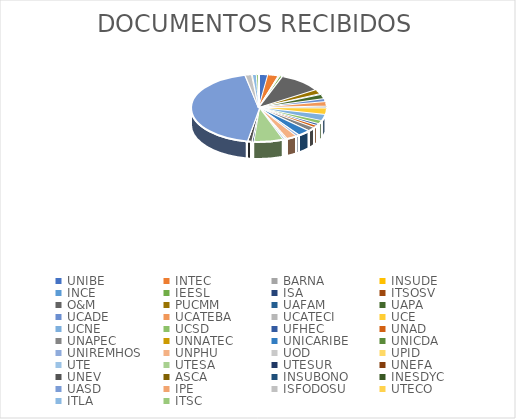
| Category | Series 0 |
|---|---|
| UNIBE | 302 |
| INTEC | 351 |
| BARNA | 1 |
| INSUDE | 26 |
| INCE | 23 |
| IEESL | 86 |
| ISA | 3 |
| ITSOSV | 5 |
| O&M | 1405 |
| PUCMM | 301 |
| UAFAM | 55 |
| UAPA | 282 |
| UCADE | 200 |
| UCATEBA | 291 |
| UCATECI | 130 |
| UCE | 410 |
| UCNE | 416 |
| UCSD | 219 |
| UFHEC | 128 |
| UNAD | 156 |
| UNAPEC | 269 |
| UNNATEC | 8 |
| UNICARIBE | 408 |
| UNICDA | 15 |
| UNIREMHOS | 96 |
| UNPHU | 339 |
| UOD | 52 |
| UPID | 26 |
| UTE | 64 |
| UTESA | 956 |
| UTESUR | 56 |
| UNEFA | 12 |
| UNEV | 135 |
| ASCA | 2 |
| INSUBONO | 3 |
| INESDYC | 1 |
| UASD | 6000 |
| IPE | 16 |
| ISFODOSU | 206 |
| UTECO | 29 |
| ITLA | 129 |
| ITSC | 72 |